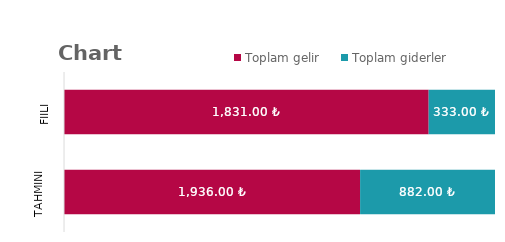
| Category | Toplam gelir | Toplam giderler |
|---|---|---|
| Tahmini | 1936 | 882 |
| Fiili | 1831 | 333 |